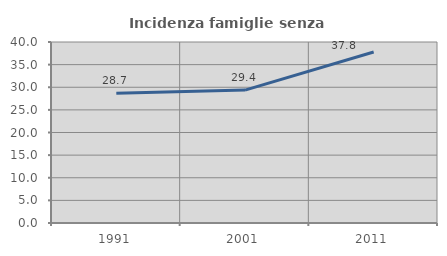
| Category | Incidenza famiglie senza nuclei |
|---|---|
| 1991.0 | 28.697 |
| 2001.0 | 29.365 |
| 2011.0 | 37.788 |